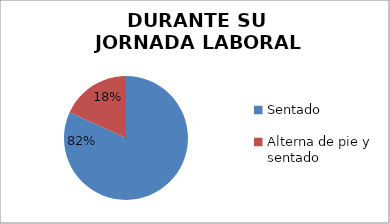
| Category | Series 0 |
|---|---|
| Sentado | 18 |
| Alterna de pie y sentado  | 4 |